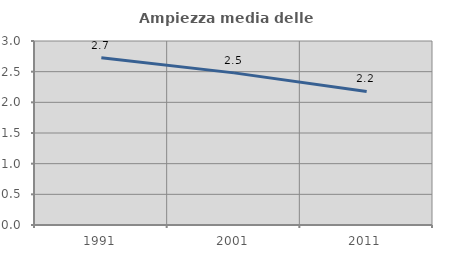
| Category | Ampiezza media delle famiglie |
|---|---|
| 1991.0 | 2.728 |
| 2001.0 | 2.48 |
| 2011.0 | 2.177 |